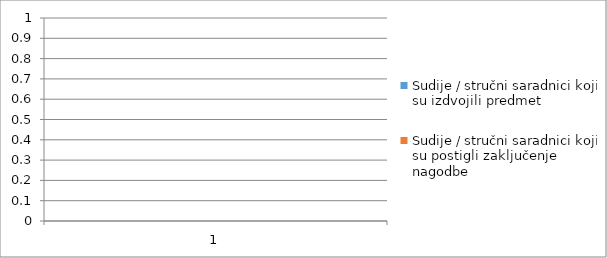
| Category | Sudije / stručni saradnici koji su izdvojili predmet | Sudije / stručni saradnici koji su postigli zaključenje nagodbe |
|---|---|---|
| 0 | 0 | 0 |